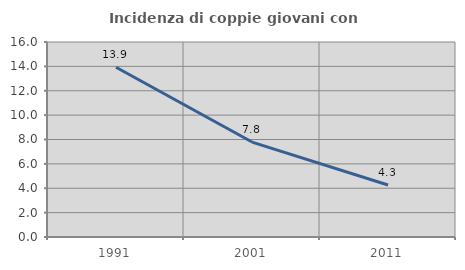
| Category | Incidenza di coppie giovani con figli |
|---|---|
| 1991.0 | 13.929 |
| 2001.0 | 7.79 |
| 2011.0 | 4.267 |